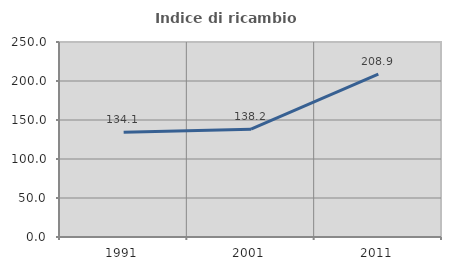
| Category | Indice di ricambio occupazionale  |
|---|---|
| 1991.0 | 134.137 |
| 2001.0 | 138.158 |
| 2011.0 | 208.929 |